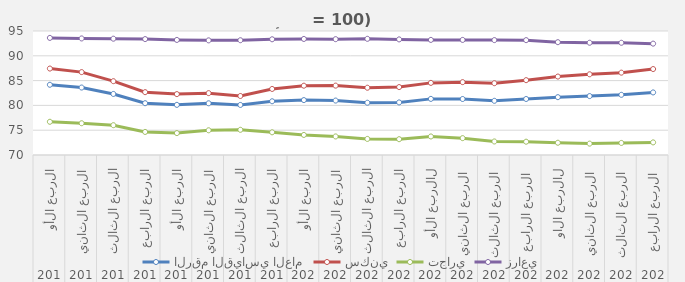
| Category | الرقم القياسي العام | سكني | تجاري | زراعي |
|---|---|---|---|---|
| 0 | 84.16 | 87.43 | 76.7 | 93.61 |
| 1 | 83.603 | 86.713 | 76.403 | 93.5 |
| 2 | 82.31 | 84.883 | 76.01 | 93.45 |
| 3 | 80.443 | 82.67 | 74.65 | 93.37 |
| 4 | 80.11 | 82.277 | 74.417 | 93.203 |
| 5 | 80.427 | 82.473 | 74.983 | 93.11 |
| 6 | 80.093 | 81.9 | 75.083 | 93.14 |
| 7 | 80.833 | 83.32 | 74.577 | 93.33 |
| 8 | 81.07 | 83.973 | 74.047 | 93.397 |
| 9 | 80.977 | 83.99 | 73.74 | 93.353 |
| 10 | 80.538 | 83.562 | 73.242 | 93.424 |
| 11 | 80.6 | 83.696 | 73.187 | 93.307 |
| 12 | 81.315 | 84.54 | 73.736 | 93.206 |
| 13 | 81.291 | 84.687 | 73.398 | 93.204 |
| 14 | 80.925 | 84.473 | 72.728 | 93.164 |
| 15 | 81.295 | 85.089 | 72.682 | 93.157 |
| 16 | 81.662 | 85.816 | 72.474 | 92.745 |
| 17 | 81.879 | 86.272 | 72.295 | 92.633 |
| 18 | 82.132 | 86.603 | 72.433 | 92.625 |
| 19 | 82.616 | 87.33 | 72.541 | 92.453 |